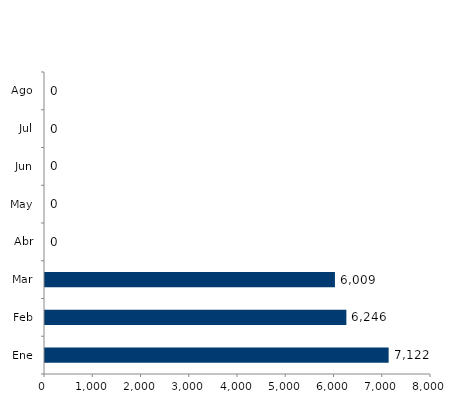
| Category | Series 0 |
|---|---|
| Ene | 7122 |
| Feb | 6246 |
| Mar | 6009 |
| Abr | 0 |
| May | 0 |
| Jun | 0 |
| Jul | 0 |
| Ago | 0 |